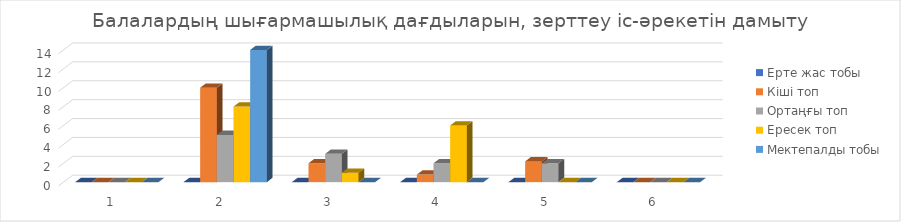
| Category | Ерте жас тобы  | Кіші топ | Ортаңғы топ | Ересек топ | Мектепалды тобы |
|---|---|---|---|---|---|
| 0 | 0 | 0 | 0 | 0 | 0 |
| 1 | 0 | 10 | 5 | 8 | 14 |
| 2 | 0 | 2 | 3 | 1 | 0 |
| 3 | 0 | 0.8 | 2 | 6 | 0 |
| 4 | 0 | 2.2 | 2 | 0 | 0 |
| 5 | 0 | 0 | 0 | 0 | 0 |